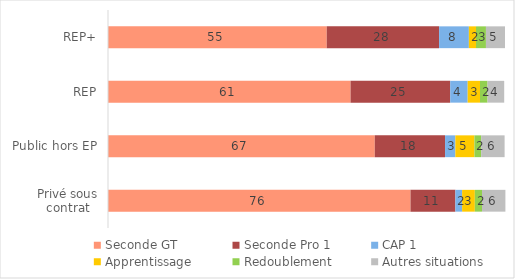
| Category | Seconde GT | Seconde Pro 1 | CAP 1 | Apprentissage | Redoublement | Autres situations |
|---|---|---|---|---|---|---|
| REP+ | 55.1 | 28.3 | 7.5 | 1.8 | 2.5 | 4.8 |
| REP | 61.1 | 25.1 | 4.4 | 3.1 | 1.9 | 4.2 |
| Public hors EP | 67.2 | 17.7 | 2.6 | 4.8 | 1.7 | 5.9 |
| Privé sous contrat | 76.2 | 11.3 | 1.7 | 3.2 | 1.8 | 5.9 |